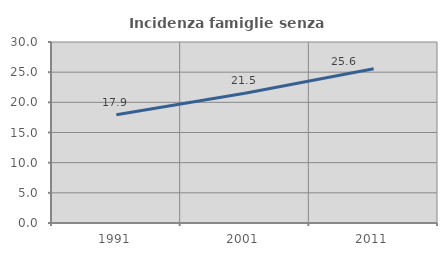
| Category | Incidenza famiglie senza nuclei |
|---|---|
| 1991.0 | 17.928 |
| 2001.0 | 21.521 |
| 2011.0 | 25.564 |